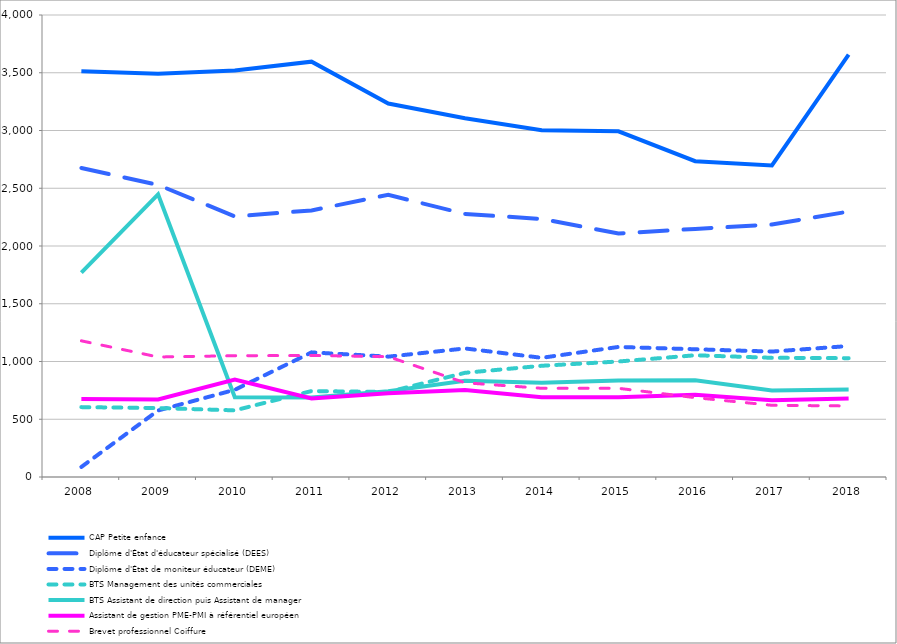
| Category | CAP Petite enfance | Diplôme d'État d'éducateur spécialisé (DEES) | Diplôme d'État de moniteur éducateur (DEME) | BTS Management des unités commerciales | BTS Assistant de direction puis Assistant de manager  | Assistant de gestion PME-PMI à référentiel européen | Brevet professionnel Coiffure |
|---|---|---|---|---|---|---|---|
| 2008.0 | 3513 | 2675 | 87 | 605 | 1770 | 676 | 1179 |
| 2009.0 | 3491 | 2529 | 576 | 597 | 2447 | 672 | 1039 |
| 2010.0 | 3520 | 2256 | 755 | 577 | 691 | 844 | 1050 |
| 2011.0 | 3596 | 2308 | 1079 | 744 | 688 | 680 | 1052 |
| 2012.0 | 3233 | 2443 | 1042 | 736 | 743 | 725 | 1042 |
| 2013.0 | 3106 | 2278 | 1113 | 902 | 833 | 754 | 816 |
| 2014.0 | 3003 | 2234 | 1032 | 963 | 817 | 690 | 768 |
| 2015.0 | 2993 | 2108 | 1126 | 1000 | 835 | 691 | 768 |
| 2016.0 | 2734 | 2148 | 1106 | 1054 | 838 | 713 | 687 |
| 2017.0 | 2698 | 2186 | 1086 | 1032 | 749 | 664 | 621 |
| 2018.0 | 3657 | 2298 | 1134 | 1029 | 757 | 680 | 615 |